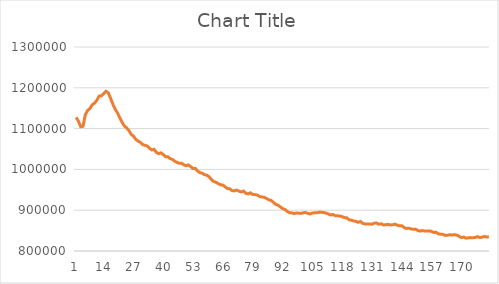
| Category | Series 0 |
|---|---|
| 0 | 1127498.25 |
| 1 | 1117871.098 |
| 2 | 1104588.246 |
| 3 | 1105761.774 |
| 4 | 1133798.406 |
| 5 | 1144726.181 |
| 6 | 1149078.606 |
| 7 | 1158519.618 |
| 8 | 1162225.463 |
| 9 | 1169174.273 |
| 10 | 1179546.509 |
| 11 | 1180457.439 |
| 12 | 1185753.396 |
| 13 | 1191442.742 |
| 14 | 1187854.568 |
| 15 | 1174502.613 |
| 16 | 1160084.16 |
| 17 | 1147842.6 |
| 18 | 1138714.805 |
| 19 | 1127254.212 |
| 20 | 1115827.892 |
| 21 | 1106746.071 |
| 22 | 1101911.377 |
| 23 | 1095235.525 |
| 24 | 1085901.366 |
| 25 | 1081529.384 |
| 26 | 1073707.555 |
| 27 | 1069455.313 |
| 28 | 1066424.153 |
| 29 | 1061007.071 |
| 30 | 1058979.551 |
| 31 | 1057450.852 |
| 32 | 1051727.14 |
| 33 | 1047752.084 |
| 34 | 1049173.129 |
| 35 | 1041591.451 |
| 36 | 1038348.95 |
| 37 | 1040624.78 |
| 38 | 1036180.089 |
| 39 | 1031119.683 |
| 40 | 1031123.665 |
| 41 | 1026438.457 |
| 42 | 1024696.82 |
| 43 | 1020119.027 |
| 44 | 1017094.172 |
| 45 | 1014831.23 |
| 46 | 1014934.198 |
| 47 | 1011162.009 |
| 48 | 1008999.999 |
| 49 | 1010895.526 |
| 50 | 1006425.229 |
| 51 | 1001998.011 |
| 52 | 1002536.802 |
| 53 | 995862.885 |
| 54 | 991986.812 |
| 55 | 990539.536 |
| 56 | 987048.187 |
| 57 | 985676.165 |
| 58 | 981785.352 |
| 59 | 975082.671 |
| 60 | 970359.694 |
| 61 | 968251.046 |
| 62 | 965152.182 |
| 63 | 962248.911 |
| 64 | 961746.738 |
| 65 | 957075.148 |
| 66 | 953137.045 |
| 67 | 952417.165 |
| 68 | 948031.198 |
| 69 | 947308.152 |
| 70 | 949294.004 |
| 71 | 946704.739 |
| 72 | 944806.682 |
| 73 | 946948.918 |
| 74 | 941367.712 |
| 75 | 939989.028 |
| 76 | 942583.819 |
| 77 | 938403.015 |
| 78 | 938263.728 |
| 79 | 937160.867 |
| 80 | 933532.965 |
| 81 | 932549.244 |
| 82 | 931613.87 |
| 83 | 928768.022 |
| 84 | 925582.647 |
| 85 | 924141.266 |
| 86 | 919264.651 |
| 87 | 914308.922 |
| 88 | 912546.892 |
| 89 | 908289.649 |
| 90 | 904031.892 |
| 91 | 902031.704 |
| 92 | 897280.067 |
| 93 | 894055.741 |
| 94 | 893516.248 |
| 95 | 891622.184 |
| 96 | 893007.356 |
| 97 | 892772.762 |
| 98 | 892082.243 |
| 99 | 893576.115 |
| 100 | 894410.589 |
| 101 | 892318.68 |
| 102 | 890875.068 |
| 103 | 893173.362 |
| 104 | 893563.002 |
| 105 | 893736.074 |
| 106 | 895287.303 |
| 107 | 894797.021 |
| 108 | 894216.402 |
| 109 | 893029.791 |
| 110 | 890641.556 |
| 111 | 888219.163 |
| 112 | 889524.673 |
| 113 | 886425.391 |
| 114 | 886147.408 |
| 115 | 885905.698 |
| 116 | 884182.137 |
| 117 | 881904.19 |
| 118 | 881548.321 |
| 119 | 876432.673 |
| 120 | 875685.083 |
| 121 | 873621.238 |
| 122 | 872631.788 |
| 123 | 870273.304 |
| 124 | 872513.726 |
| 125 | 867525.041 |
| 126 | 866383.764 |
| 127 | 866110.007 |
| 128 | 866079.396 |
| 129 | 865691.201 |
| 130 | 868279.504 |
| 131 | 868394.585 |
| 132 | 865577.222 |
| 133 | 866822.142 |
| 134 | 863831.057 |
| 135 | 864366.262 |
| 136 | 865299.889 |
| 137 | 863841.547 |
| 138 | 864224.336 |
| 139 | 865866.658 |
| 140 | 863455.063 |
| 141 | 861577.224 |
| 142 | 862029.136 |
| 143 | 857781.806 |
| 144 | 855143.983 |
| 145 | 855986.951 |
| 146 | 854136.233 |
| 147 | 853124.642 |
| 148 | 853600.371 |
| 149 | 850213.394 |
| 150 | 848781.379 |
| 151 | 850022.358 |
| 152 | 849056.946 |
| 153 | 848726.396 |
| 154 | 849317.672 |
| 155 | 847899.031 |
| 156 | 845452.375 |
| 157 | 845822.101 |
| 158 | 842063.011 |
| 159 | 841098.776 |
| 160 | 840685.29 |
| 161 | 838225.663 |
| 162 | 838589.017 |
| 163 | 840025.294 |
| 164 | 839096.346 |
| 165 | 840088.088 |
| 166 | 839203.25 |
| 167 | 836147.607 |
| 168 | 832725.985 |
| 169 | 834183.968 |
| 170 | 831442.353 |
| 171 | 832019.159 |
| 172 | 832805.693 |
| 173 | 832643.706 |
| 174 | 833108.764 |
| 175 | 835172.02 |
| 176 | 833198.509 |
| 177 | 833554.951 |
| 178 | 835760.608 |
| 179 | 834446.736 |
| 180 | 834102.744 |